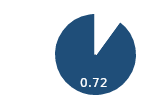
| Category | Twitter |
|---|---|
| 0 | 0.08 |
| 1 | 0.72 |